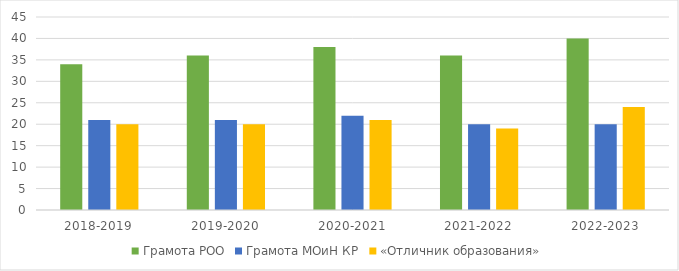
| Category | Грамота РОО | Грамота МОиН КР | «Отличник образования» |
|---|---|---|---|
| 2018-2019 | 34 | 21 | 20 |
| 2019-2020 | 36 | 21 | 20 |
| 2020-2021 | 38 | 22 | 21 |
| 2021-2022 | 36 | 20 | 19 |
| 2022-2023 | 40 | 20 | 24 |